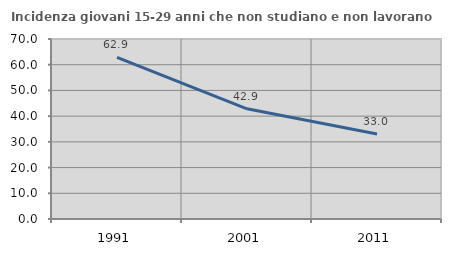
| Category | Incidenza giovani 15-29 anni che non studiano e non lavorano  |
|---|---|
| 1991.0 | 62.865 |
| 2001.0 | 42.857 |
| 2011.0 | 33.043 |